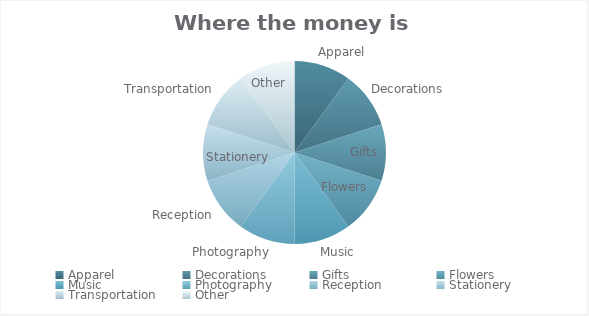
| Category | Amount |
|---|---|
| Apparel | 1 |
| Decorations | 1 |
| Gifts | 1 |
| Flowers | 1 |
| Music | 1 |
| Photography | 1 |
| Reception | 1 |
| Stationery | 1 |
| Transportation | 1 |
| Other | 1 |